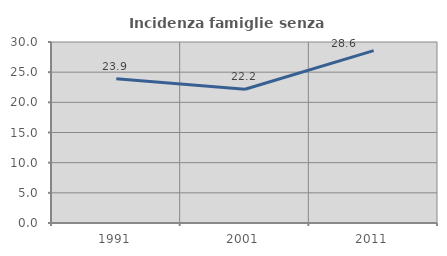
| Category | Incidenza famiglie senza nuclei |
|---|---|
| 1991.0 | 23.9 |
| 2001.0 | 22.172 |
| 2011.0 | 28.561 |